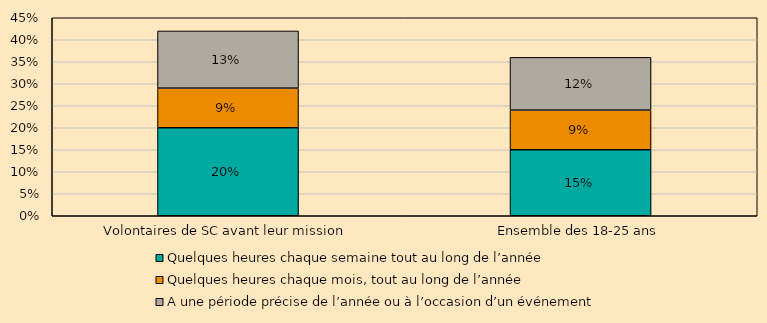
| Category | Quelques heures chaque semaine tout au long de l’année | Quelques heures chaque mois, tout au long de l’année | A une période précise de l’année ou à l’occasion d’un événement |
|---|---|---|---|
| Volontaires de SC avant leur mission | 0.2 | 0.09 | 0.13 |
| Ensemble des 18-25 ans | 0.15 | 0.09 | 0.12 |